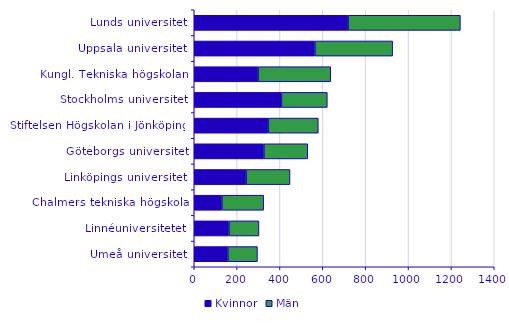
| Category | Kvinnor | Män |
|---|---|---|
| Umeå universitet | 157 | 138 |
| Linnéuniversitetet | 162 | 140 |
| Chalmers tekniska högskola | 129 | 195 |
| Linköpings universitet | 242 | 205 |
| Göteborgs universitet | 325 | 205 |
| Stiftelsen Högskolan i Jönköping | 345 | 234 |
| Stockholms universitet | 407 | 214 |
| Kungl. Tekniska högskolan | 298 | 339 |
| Uppsala universitet | 563 | 363 |
| Lunds universitet | 718 | 524 |